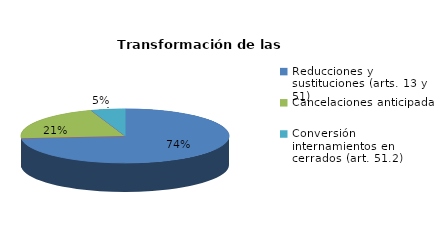
| Category | Series 0 |
|---|---|
| Reducciones y sustituciones (arts. 13 y 51) | 14 |
| Por quebrantamiento (art. 50.2) | 0 |
| Cancelaciones anticipadas | 4 |
| Traslado a Centros Penitenciarios | 0 |
| Conversión internamientos en cerrados (art. 51.2) | 1 |